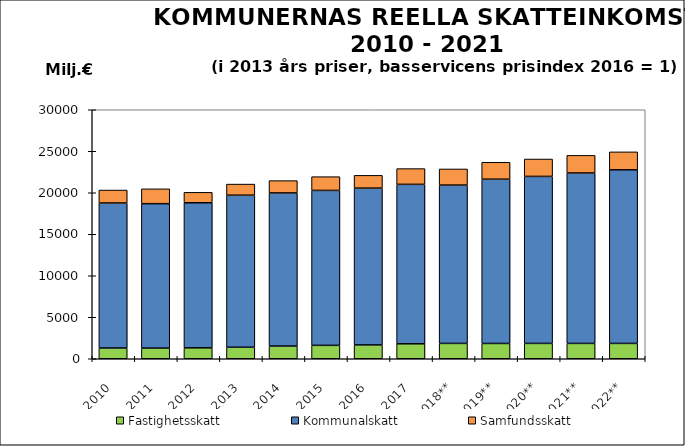
| Category | Fastighetsskatt | Kommunalskatt | Samfundsskatt |
|---|---|---|---|
| 2010 | 1296.352 | 17470.608 | 1559.108 |
| 2011 | 1285.841 | 17398.198 | 1789.548 |
| 2012 | 1317.524 | 17476.044 | 1257.689 |
| 2013 | 1389.588 | 18317.532 | 1337.058 |
| 2014 | 1532.817 | 18447.864 | 1481.581 |
| 2015 | 1616.418 | 18667.185 | 1654.236 |
| 2016 | 1669.703 | 18890.563 | 1537.872 |
| 2017 | 1802.836 | 19209.143 | 1898.989 |
| 2018** | 1850.957 | 19075.982 | 1941.988 |
| 2019** | 1844.019 | 19788.502 | 2042.3 |
| 2020** | 1851.186 | 20118.177 | 2096.052 |
| 2021** | 1850.091 | 20534.082 | 2119.896 |
| 2022** | 1848.866 | 20915.893 | 2161.751 |